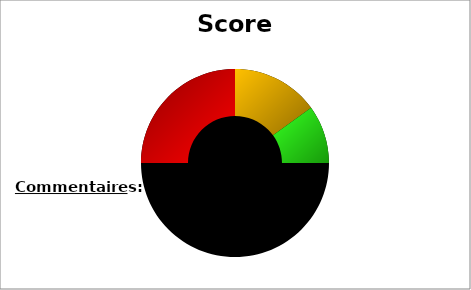
| Category | Series 1 |
|---|---|
| nan | 0 |
| 0.0 | 1 |
| nan | 0 |